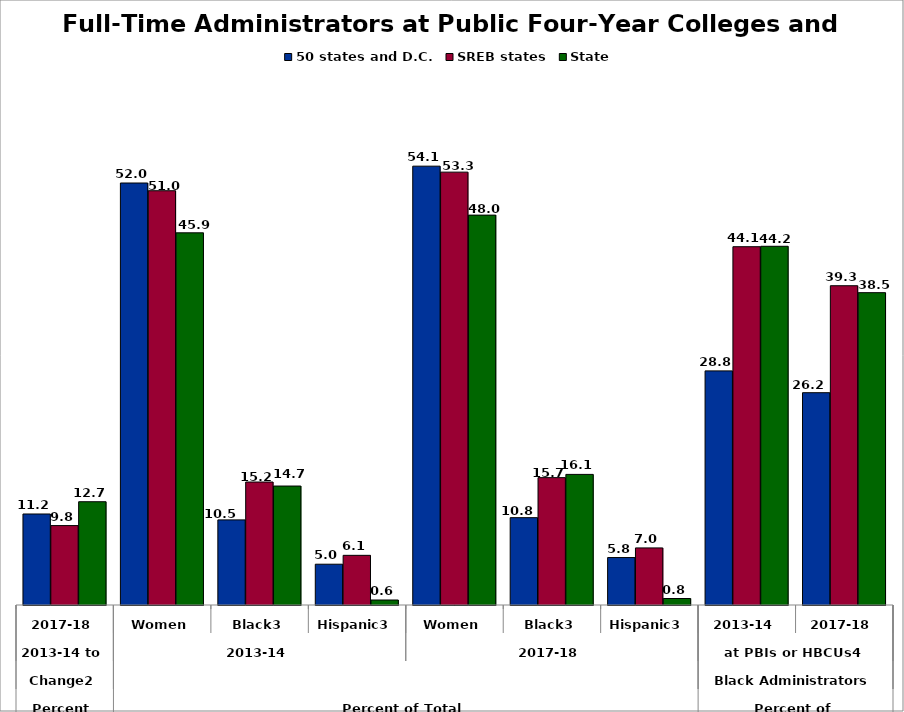
| Category | 50 states and D.C. | SREB states | State |
|---|---|---|---|
| 0 | 11.213 | 9.784 | 12.724 |
| 1 | 51.991 | 51.038 | 45.853 |
| 2 | 10.487 | 15.151 | 14.657 |
| 3 | 5.025 | 6.119 | 0.615 |
| 4 | 54.066 | 53.331 | 48.035 |
| 5 | 10.761 | 15.692 | 16.091 |
| 6 | 5.846 | 7.033 | 0.8 |
| 7 | 28.844 | 44.143 | 44.194 |
| 8 | 26.156 | 39.335 | 38.482 |